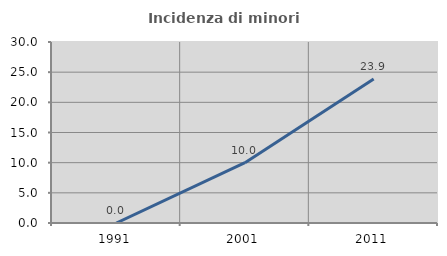
| Category | Incidenza di minori stranieri |
|---|---|
| 1991.0 | 0 |
| 2001.0 | 10 |
| 2011.0 | 23.881 |